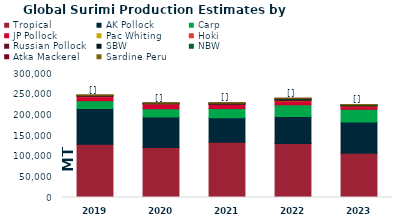
| Category | Tropical | AK Pollock | Carp | JP Pollock | Pac Whiting | Hoki | Russian Pollock | SBW | NBW | Atka Mackerel | Sardine Peru |
|---|---|---|---|---|---|---|---|---|---|---|---|
| 2019.0 | 128999.902 | 86026 | 18833.461 | 9095.212 | 0 | 2430 | 141.165 | 952 | 989.744 | 44.778 | 408 |
| 2020.0 | 121197.358 | 73647 | 20118.421 | 10025.86 | 0 | 1727.8 | 10.5 | 934.2 | 667.789 | 60.837 | 250 |
| 2021.0 | 133699.197 | 59033 | 22425.343 | 9874.985 | 0 | 1383.2 | 86.504 | 1198.8 | 1072.072 | 63.742 | 120 |
| 2022.0 | 130744.134 | 65191 | 28572.87 | 7920.634 | 3.327 | 1652.4 | 3173.23 | 1232.6 | 1128.739 | 320.59 | 96 |
| 2023.0 | 106842.395 | 75954 | 30947.655 | 5143.514 | 0 | 1678.2 | 1873.307 | 806.8 | 1080.035 | 174.867 | 216 |